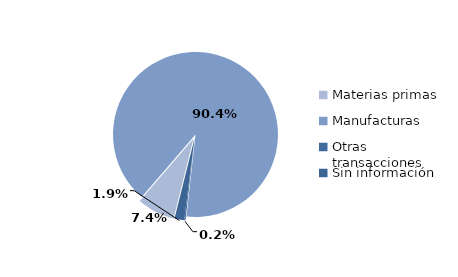
| Category | Series 0 |
|---|---|
| Materias primas | 217.443 |
| Manufacturas | 2653.365 |
| Otras transacciones | 7.218 |
| Sin información | 55.628 |